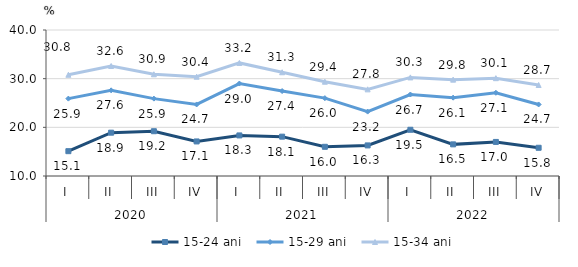
| Category | 15-24 ani | 15-29 ani | 15-34 ani |
|---|---|---|---|
| 0 | 15.1 | 25.9 | 30.8 |
| 1 | 18.9 | 27.6 | 32.6 |
| 2 | 19.2 | 25.9 | 30.9 |
| 3 | 17.1 | 24.7 | 30.4 |
| 4 | 18.335 | 28.999 | 33.235 |
| 5 | 18.083 | 27.448 | 31.318 |
| 6 | 16 | 26 | 29.373 |
| 7 | 16.283 | 23.232 | 27.8 |
| 8 | 19.497 | 26.744 | 30.262 |
| 9 | 16.5 | 26.1 | 29.8 |
| 10 | 17 | 27.1 | 30.1 |
| 11 | 15.8 | 24.7 | 28.7 |